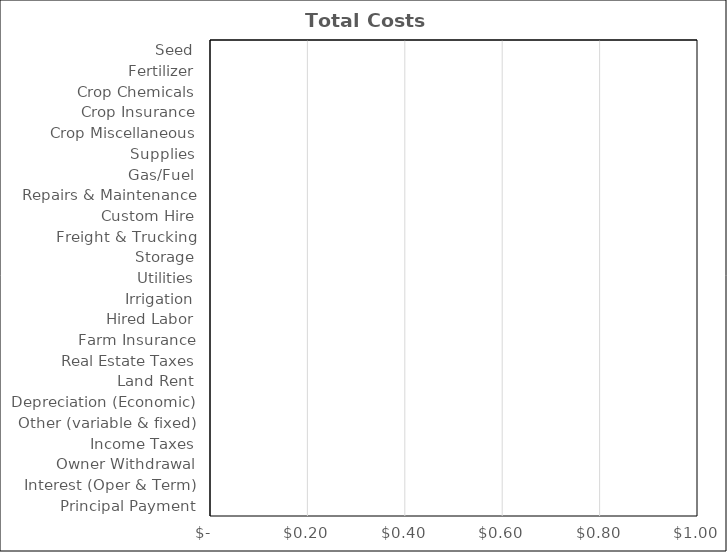
| Category | Alfalfa/Grass |
|---|---|
| Seed | 0 |
| Fertilizer | 0 |
| Crop Chemicals | 0 |
| Crop Insurance | 0 |
| Crop Miscellaneous | 0 |
| Supplies | 0 |
| Gas/Fuel | 0 |
| Repairs & Maintenance | 0 |
| Custom Hire | 0 |
| Freight & Trucking | 0 |
| Storage | 0 |
| Utilities | 0 |
| Irrigation | 0 |
| Hired Labor | 0 |
| Farm Insurance | 0 |
| Real Estate Taxes | 0 |
| Land Rent | 0 |
| Depreciation (Economic) | 0 |
| Other (variable & fixed) | 0 |
| Income Taxes | 0 |
| Owner Withdrawal | 0 |
| Interest (Oper & Term) | 0 |
| Principal Payment | 0 |